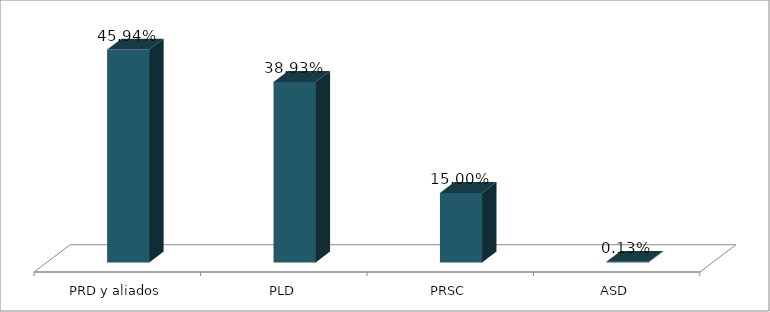
| Category | Votos % |
|---|---|
| PRD y aliados | 0.459 |
| PLD | 0.389 |
| PRSC | 0.15 |
| ASD | 0.001 |